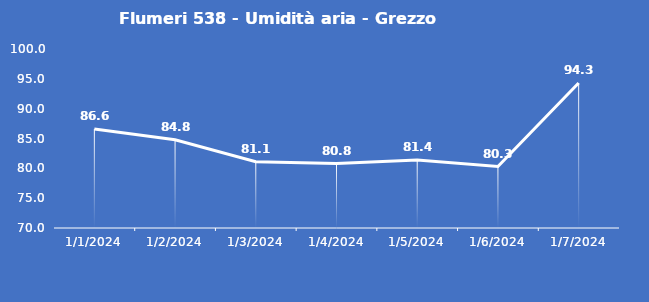
| Category | Flumeri 538 - Umidità aria - Grezzo (%) |
|---|---|
| 1/1/24 | 86.6 |
| 1/2/24 | 84.8 |
| 1/3/24 | 81.1 |
| 1/4/24 | 80.8 |
| 1/5/24 | 81.4 |
| 1/6/24 | 80.3 |
| 1/7/24 | 94.3 |